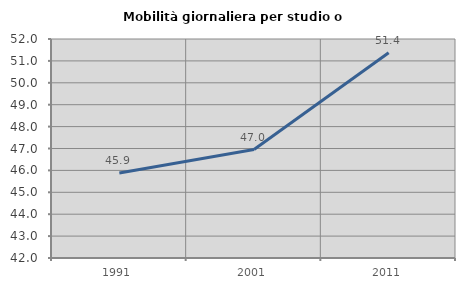
| Category | Mobilità giornaliera per studio o lavoro |
|---|---|
| 1991.0 | 45.878 |
| 2001.0 | 46.95 |
| 2011.0 | 51.373 |